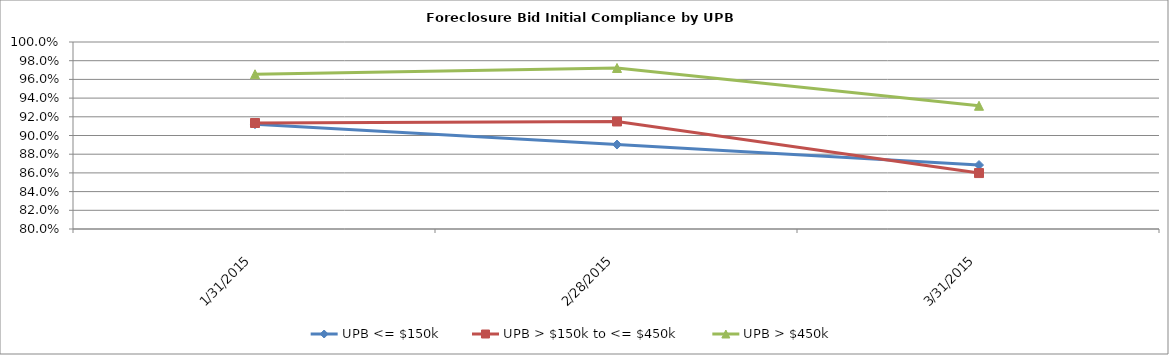
| Category | UPB <= $150k | UPB > $150k to <= $450k | UPB > $450k |
|---|---|---|---|
| 1/31/15 | 0.912 | 0.913 | 0.966 |
| 2/28/15 | 0.89 | 0.915 | 0.972 |
| 3/31/15 | 0.868 | 0.86 | 0.932 |